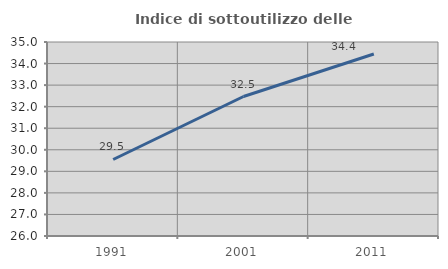
| Category | Indice di sottoutilizzo delle abitazioni  |
|---|---|
| 1991.0 | 29.55 |
| 2001.0 | 32.471 |
| 2011.0 | 34.445 |